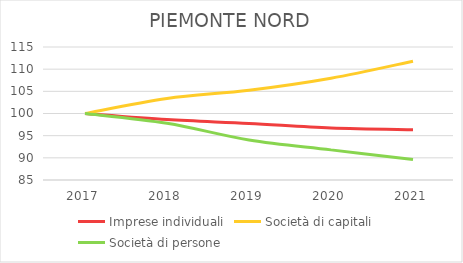
| Category | Imprese individuali | Società di capitali | Società di persone |
|---|---|---|---|
| 2017.0 | 100 | 100 | 100 |
| 2018.0 | 98.632 | 103.407 | 97.788 |
| 2019.0 | 97.756 | 105.248 | 94.025 |
| 2020.0 | 96.725 | 107.965 | 91.797 |
| 2021.0 | 96.358 | 111.796 | 89.641 |